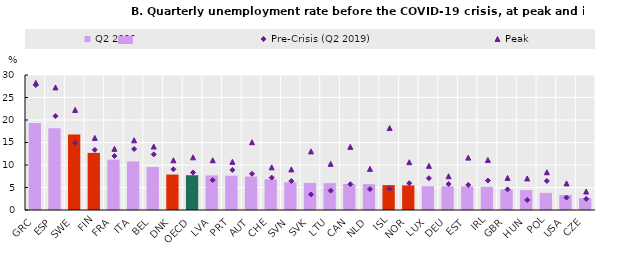
| Category | Q2 2022 |
|---|---|
| GRC | 19.328 |
| ESP | 18.17 |
| SWE | 16.803 |
| FIN | 12.688 |
| FRA | 11.189 |
| ITA | 10.788 |
| BEL | 9.543 |
| DNK | 7.873 |
| OECD | 7.723 |
| LVA | 7.683 |
| PRT | 7.613 |
| AUT | 7.427 |
| CHE | 6.823 |
| SVN | 6.154 |
| SVK | 6.017 |
| LTU | 5.974 |
| CAN | 5.775 |
| NLD | 5.748 |
| ISL | 5.533 |
| NOR | 5.462 |
| LUX | 5.274 |
| DEU | 5.27 |
| EST | 5.221 |
| IRL | 5.131 |
| GBR | 4.539 |
| HUN | 4.428 |
| POL | 3.807 |
| USA | 3.347 |
| CZE | 2.639 |